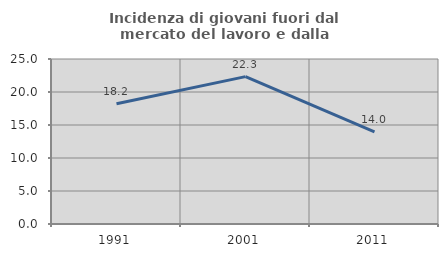
| Category | Incidenza di giovani fuori dal mercato del lavoro e dalla formazione  |
|---|---|
| 1991.0 | 18.228 |
| 2001.0 | 22.334 |
| 2011.0 | 13.965 |